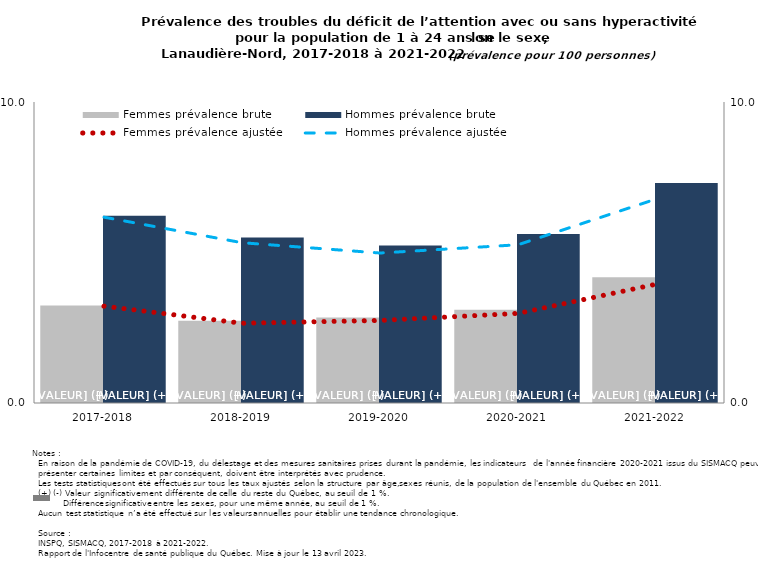
| Category | Femmes prévalence brute | Hommes prévalence brute |
|---|---|---|
| 2017-2018 | 3.242 | 6.223 |
| 2018-2019 | 2.73 | 5.498 |
| 2019-2020 | 2.84 | 5.235 |
| 2020-2021 | 3.101 | 5.619 |
| 2021-2022 | 4.175 | 7.306 |